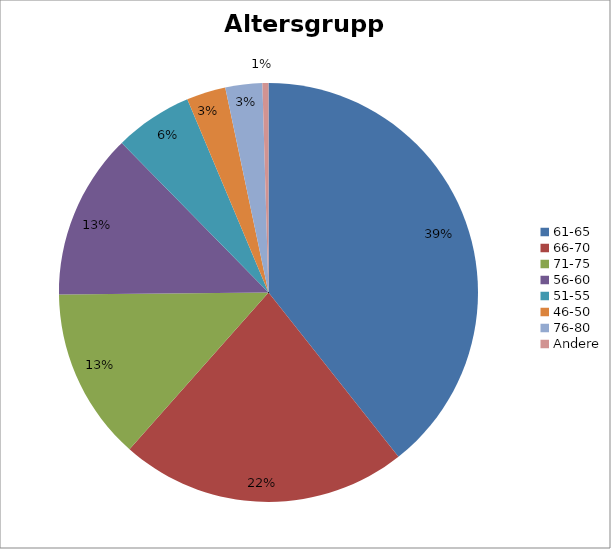
| Category | Series 0 |
|---|---|
| 61-65 | 6667 |
| 66-70 | 3760 |
| 71-75 | 2253 |
| 56-60 | 2170 |
| 51-55 | 1019 |
| 46-50 | 512 |
| 76-80 | 482 |
| Andere | 79 |